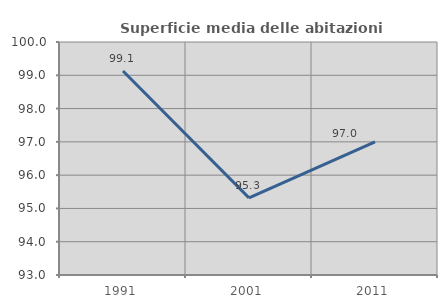
| Category | Superficie media delle abitazioni occupate |
|---|---|
| 1991.0 | 99.128 |
| 2001.0 | 95.316 |
| 2011.0 | 97.001 |